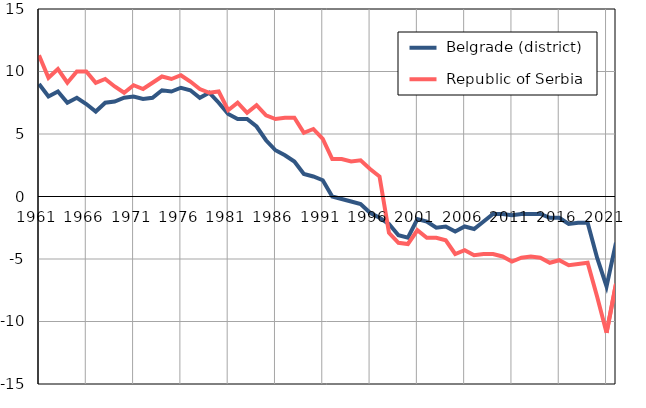
| Category |  Belgrade (district) |  Republic of Serbia |
|---|---|---|
| 1961.0 | 9 | 11.3 |
| 1962.0 | 8 | 9.5 |
| 1963.0 | 8.4 | 10.2 |
| 1964.0 | 7.5 | 9.1 |
| 1965.0 | 7.9 | 10 |
| 1966.0 | 7.4 | 10 |
| 1967.0 | 6.8 | 9.1 |
| 1968.0 | 7.5 | 9.4 |
| 1969.0 | 7.6 | 8.8 |
| 1970.0 | 7.9 | 8.3 |
| 1971.0 | 8 | 8.9 |
| 1972.0 | 7.8 | 8.6 |
| 1973.0 | 7.9 | 9.1 |
| 1974.0 | 8.5 | 9.6 |
| 1975.0 | 8.4 | 9.4 |
| 1976.0 | 8.7 | 9.7 |
| 1977.0 | 8.5 | 9.2 |
| 1978.0 | 7.9 | 8.6 |
| 1979.0 | 8.3 | 8.3 |
| 1980.0 | 7.5 | 8.4 |
| 1981.0 | 6.6 | 6.9 |
| 1982.0 | 6.2 | 7.5 |
| 1983.0 | 6.2 | 6.7 |
| 1984.0 | 5.6 | 7.3 |
| 1985.0 | 4.5 | 6.5 |
| 1986.0 | 3.7 | 6.2 |
| 1987.0 | 3.3 | 6.3 |
| 1988.0 | 2.8 | 6.3 |
| 1989.0 | 1.8 | 5.1 |
| 1990.0 | 1.6 | 5.4 |
| 1991.0 | 1.3 | 4.6 |
| 1992.0 | 0 | 3 |
| 1993.0 | -0.2 | 3 |
| 1994.0 | -0.4 | 2.8 |
| 1995.0 | -0.6 | 2.9 |
| 1996.0 | -1.3 | 2.2 |
| 1997.0 | -1.7 | 1.6 |
| 1998.0 | -2.2 | -2.9 |
| 1999.0 | -3.1 | -3.7 |
| 2000.0 | -3.3 | -3.8 |
| 2001.0 | -1.8 | -2.7 |
| 2002.0 | -2 | -3.3 |
| 2003.0 | -2.5 | -3.3 |
| 2004.0 | -2.4 | -3.5 |
| 2005.0 | -2.8 | -4.6 |
| 2006.0 | -2.4 | -4.3 |
| 2007.0 | -2.6 | -4.7 |
| 2008.0 | -2 | -4.6 |
| 2009.0 | -1.4 | -4.6 |
| 2010.0 | -1.4 | -4.8 |
| 2011.0 | -1.5 | -5.2 |
| 2012.0 | -1.4 | -4.9 |
| 2013.0 | -1.4 | -4.8 |
| 2014.0 | -1.4 | -4.9 |
| 2015.0 | -1.7 | -5.3 |
| 2016.0 | -1.7 | -5.1 |
| 2017.0 | -2.2 | -5.5 |
| 2018.0 | -2.1 | -5.4 |
| 2019.0 | -2.1 | -5.3 |
| 2020.0 | -4.9 | -8 |
| 2021.0 | -7.2 | -10.9 |
| 2022.0 | -3.7 | -7 |